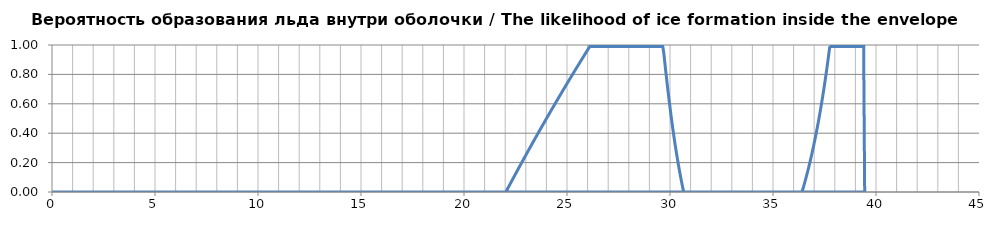
| Category | Вероятность образования льда внутри оболочки / The likelihood of ice formation inside the envelope |
|---|---|
| 0.0 | 0 |
| 0.05 | 0 |
| 0.1 | 0 |
| 0.15000000000000002 | 0 |
| 0.2 | 0 |
| 0.25 | 0 |
| 0.3 | 0 |
| 0.35 | 0 |
| 0.39999999999999997 | 0 |
| 0.44999999999999996 | 0 |
| 0.49999999999999994 | 0 |
| 0.5499999999999999 | 0 |
| 0.6 | 0 |
| 0.65 | 0 |
| 0.7000000000000001 | 0 |
| 0.7500000000000001 | 0 |
| 0.8000000000000002 | 0 |
| 0.8500000000000002 | 0 |
| 0.9000000000000002 | 0 |
| 0.9500000000000003 | 0 |
| 1.0000000000000002 | 0 |
| 1.0500000000000003 | 0 |
| 1.1000000000000003 | 0 |
| 1.1500000000000004 | 0 |
| 1.2000000000000004 | 0 |
| 1.2500000000000004 | 0 |
| 1.3000000000000005 | 0 |
| 1.3500000000000005 | 0 |
| 1.4000000000000006 | 0 |
| 1.4500000000000006 | 0 |
| 1.5000000000000007 | 0 |
| 1.5500000000000007 | 0 |
| 1.6000000000000008 | 0 |
| 1.6500000000000008 | 0 |
| 1.7000000000000008 | 0 |
| 1.7500000000000009 | 0 |
| 1.800000000000001 | 0 |
| 1.850000000000001 | 0 |
| 1.900000000000001 | 0 |
| 1.950000000000001 | 0 |
| 2.000000000000001 | 0 |
| 2.0500000000000007 | 0 |
| 2.1000000000000005 | 0 |
| 2.1500000000000004 | 0 |
| 2.2 | 0 |
| 2.25 | 0 |
| 2.3 | 0 |
| 2.3499999999999996 | 0 |
| 2.3999999999999995 | 0 |
| 2.4499999999999993 | 0 |
| 2.499999999999999 | 0 |
| 2.549999999999999 | 0 |
| 2.5999999999999988 | 0 |
| 2.6499999999999986 | 0 |
| 2.6999999999999984 | 0 |
| 2.7499999999999982 | 0 |
| 2.799999999999998 | 0 |
| 2.849999999999998 | 0 |
| 2.8999999999999977 | 0 |
| 2.9499999999999975 | 0 |
| 2.9999999999999973 | 0 |
| 3.049999999999997 | 0 |
| 3.099999999999997 | 0 |
| 3.149999999999997 | 0 |
| 3.1999999999999966 | 0 |
| 3.2499999999999964 | 0 |
| 3.2999999999999963 | 0 |
| 3.349999999999996 | 0 |
| 3.399999999999996 | 0 |
| 3.4499999999999957 | 0 |
| 3.4999999999999956 | 0 |
| 3.5499999999999954 | 0 |
| 3.599999999999995 | 0 |
| 3.649999999999995 | 0 |
| 3.699999999999995 | 0 |
| 3.7499999999999947 | 0 |
| 3.7999999999999945 | 0 |
| 3.8499999999999943 | 0 |
| 3.899999999999994 | 0 |
| 3.949999999999994 | 0 |
| 3.999999999999994 | 0 |
| 4.049999999999994 | 0 |
| 4.099999999999993 | 0 |
| 4.149999999999993 | 0 |
| 4.199999999999993 | 0 |
| 4.249999999999993 | 0 |
| 4.299999999999993 | 0 |
| 4.3499999999999925 | 0 |
| 4.399999999999992 | 0 |
| 4.449999999999992 | 0 |
| 4.499999999999992 | 0 |
| 4.549999999999992 | 0 |
| 4.599999999999992 | 0 |
| 4.6499999999999915 | 0 |
| 4.699999999999991 | 0 |
| 4.749999999999991 | 0 |
| 4.799999999999991 | 0 |
| 4.849999999999991 | 0 |
| 4.899999999999991 | 0 |
| 4.94999999999999 | 0 |
| 4.99999999999999 | 0 |
| 5.04999999999999 | 0 |
| 5.09999999999999 | 0 |
| 5.14999999999999 | 0 |
| 5.1999999999999895 | 0 |
| 5.249999999999989 | 0 |
| 5.299999999999989 | 0 |
| 5.349999999999989 | 0 |
| 5.399999999999989 | 0 |
| 5.449999999999989 | 0 |
| 5.4999999999999885 | 0 |
| 5.549999999999988 | 0 |
| 5.599999999999988 | 0 |
| 5.649999999999988 | 0 |
| 5.699999999999988 | 0 |
| 5.749999999999988 | 0 |
| 5.799999999999987 | 0 |
| 5.849999999999987 | 0 |
| 5.899999999999987 | 0 |
| 5.949999999999987 | 0 |
| 5.999999999999987 | 0 |
| 6.0499999999999865 | 0 |
| 6.099999999999986 | 0 |
| 6.149999999999986 | 0 |
| 6.199999999999986 | 0 |
| 6.249999999999986 | 0 |
| 6.299999999999986 | 0 |
| 6.349999999999985 | 0 |
| 6.399999999999985 | 0 |
| 6.449999999999985 | 0 |
| 6.499999999999985 | 0 |
| 6.549999999999985 | 0 |
| 6.5999999999999845 | 0 |
| 6.649999999999984 | 0 |
| 6.699999999999984 | 0 |
| 6.749999999999984 | 0 |
| 6.799999999999984 | 0 |
| 6.849999999999984 | 0 |
| 6.8999999999999835 | 0 |
| 6.949999999999983 | 0 |
| 6.999999999999983 | 0 |
| 7.049999999999983 | 0 |
| 7.099999999999983 | 0 |
| 7.149999999999983 | 0 |
| 7.199999999999982 | 0 |
| 7.249999999999982 | 0 |
| 7.299999999999982 | 0 |
| 7.349999999999982 | 0 |
| 7.399999999999982 | 0 |
| 7.4499999999999815 | 0 |
| 7.499999999999981 | 0 |
| 7.549999999999981 | 0 |
| 7.599999999999981 | 0 |
| 7.649999999999981 | 0 |
| 7.699999999999981 | 0 |
| 7.7499999999999805 | 0 |
| 7.79999999999998 | 0 |
| 7.84999999999998 | 0 |
| 7.89999999999998 | 0 |
| 7.94999999999998 | 0 |
| 7.99999999999998 | 0 |
| 8.04999999999998 | 0 |
| 8.09999999999998 | 0 |
| 8.14999999999998 | 0 |
| 8.199999999999982 | 0 |
| 8.249999999999982 | 0 |
| 8.299999999999983 | 0 |
| 8.349999999999984 | 0 |
| 8.399999999999984 | 0 |
| 8.449999999999985 | 0 |
| 8.499999999999986 | 0 |
| 8.549999999999986 | 0 |
| 8.599999999999987 | 0 |
| 8.649999999999988 | 0 |
| 8.699999999999989 | 0 |
| 8.74999999999999 | 0 |
| 8.79999999999999 | 0 |
| 8.84999999999999 | 0 |
| 8.899999999999991 | 0 |
| 8.949999999999992 | 0 |
| 8.999999999999993 | 0 |
| 9.049999999999994 | 0 |
| 9.099999999999994 | 0 |
| 9.149999999999995 | 0 |
| 9.199999999999996 | 0 |
| 9.249999999999996 | 0 |
| 9.299999999999997 | 0 |
| 9.349999999999998 | 0 |
| 9.399999999999999 | 0 |
| 9.45 | 0 |
| 9.5 | 0 |
| 9.55 | 0 |
| 9.600000000000001 | 0 |
| 9.650000000000002 | 0 |
| 9.700000000000003 | 0 |
| 9.750000000000004 | 0 |
| 9.800000000000004 | 0 |
| 9.850000000000005 | 0 |
| 9.900000000000006 | 0 |
| 9.950000000000006 | 0 |
| 10.000000000000007 | 0 |
| 10.050000000000008 | 0 |
| 10.100000000000009 | 0 |
| 10.15000000000001 | 0 |
| 10.20000000000001 | 0 |
| 10.25000000000001 | 0 |
| 10.300000000000011 | 0 |
| 10.350000000000012 | 0 |
| 10.400000000000013 | 0 |
| 10.450000000000014 | 0 |
| 10.500000000000014 | 0 |
| 10.550000000000015 | 0 |
| 10.600000000000016 | 0 |
| 10.650000000000016 | 0 |
| 10.700000000000017 | 0 |
| 10.750000000000018 | 0 |
| 10.800000000000018 | 0 |
| 10.85000000000002 | 0 |
| 10.90000000000002 | 0 |
| 10.95000000000002 | 0 |
| 11.000000000000021 | 0 |
| 11.050000000000022 | 0 |
| 11.100000000000023 | 0 |
| 11.150000000000023 | 0 |
| 11.200000000000024 | 0 |
| 11.250000000000025 | 0 |
| 11.300000000000026 | 0 |
| 11.350000000000026 | 0 |
| 11.400000000000027 | 0 |
| 11.450000000000028 | 0 |
| 11.500000000000028 | 0 |
| 11.55000000000003 | 0 |
| 11.60000000000003 | 0 |
| 11.65000000000003 | 0 |
| 11.700000000000031 | 0 |
| 11.750000000000032 | 0 |
| 11.800000000000033 | 0 |
| 11.850000000000033 | 0 |
| 11.900000000000034 | 0 |
| 11.950000000000035 | 0 |
| 12.000000000000036 | 0 |
| 12.050000000000036 | 0 |
| 12.100000000000037 | 0 |
| 12.150000000000038 | 0 |
| 12.200000000000038 | 0 |
| 12.250000000000039 | 0 |
| 12.30000000000004 | 0 |
| 12.35000000000004 | 0 |
| 12.400000000000041 | 0 |
| 12.450000000000042 | 0 |
| 12.500000000000043 | 0 |
| 12.550000000000043 | 0 |
| 12.600000000000044 | 0 |
| 12.650000000000045 | 0 |
| 12.700000000000045 | 0 |
| 12.750000000000046 | 0 |
| 12.800000000000047 | 0 |
| 12.850000000000048 | 0 |
| 12.900000000000048 | 0 |
| 12.950000000000049 | 0 |
| 13.00000000000005 | 0 |
| 13.05000000000005 | 0 |
| 13.100000000000051 | 0 |
| 13.150000000000052 | 0 |
| 13.200000000000053 | 0 |
| 13.250000000000053 | 0 |
| 13.300000000000054 | 0 |
| 13.350000000000055 | 0 |
| 13.400000000000055 | 0 |
| 13.450000000000056 | 0 |
| 13.500000000000057 | 0 |
| 13.550000000000058 | 0 |
| 13.600000000000058 | 0 |
| 13.650000000000059 | 0 |
| 13.70000000000006 | 0 |
| 13.75000000000006 | 0 |
| 13.800000000000061 | 0 |
| 13.850000000000062 | 0 |
| 13.900000000000063 | 0 |
| 13.950000000000063 | 0 |
| 14.000000000000064 | 0 |
| 14.050000000000065 | 0 |
| 14.100000000000065 | 0 |
| 14.150000000000066 | 0 |
| 14.200000000000067 | 0 |
| 14.250000000000068 | 0 |
| 14.300000000000068 | 0 |
| 14.350000000000069 | 0 |
| 14.40000000000007 | 0 |
| 14.45000000000007 | 0 |
| 14.500000000000071 | 0 |
| 14.550000000000072 | 0 |
| 14.600000000000072 | 0 |
| 14.650000000000073 | 0 |
| 14.700000000000074 | 0 |
| 14.750000000000075 | 0 |
| 14.800000000000075 | 0 |
| 14.850000000000076 | 0 |
| 14.900000000000077 | 0 |
| 14.950000000000077 | 0 |
| 15.000000000000078 | 0 |
| 15.050000000000079 | 0 |
| 15.10000000000008 | 0 |
| 15.15000000000008 | 0 |
| 15.200000000000081 | 0 |
| 15.250000000000082 | 0 |
| 15.300000000000082 | 0 |
| 15.350000000000083 | 0 |
| 15.400000000000084 | 0 |
| 15.450000000000085 | 0 |
| 15.500000000000085 | 0 |
| 15.550000000000086 | 0 |
| 15.600000000000087 | 0 |
| 15.650000000000087 | 0 |
| 15.700000000000088 | 0 |
| 15.750000000000089 | 0 |
| 15.80000000000009 | 0 |
| 15.85000000000009 | 0 |
| 15.900000000000091 | 0 |
| 15.950000000000092 | 0 |
| 16.000000000000092 | 0 |
| 16.050000000000093 | 0 |
| 16.100000000000094 | 0 |
| 16.150000000000095 | 0 |
| 16.200000000000095 | 0 |
| 16.250000000000096 | 0 |
| 16.300000000000097 | 0 |
| 16.350000000000097 | 0 |
| 16.400000000000098 | 0 |
| 16.4500000000001 | 0 |
| 16.5000000000001 | 0 |
| 16.5500000000001 | 0 |
| 16.6000000000001 | 0 |
| 16.6500000000001 | 0 |
| 16.700000000000102 | 0 |
| 16.750000000000103 | 0 |
| 16.800000000000104 | 0 |
| 16.850000000000104 | 0 |
| 16.900000000000105 | 0 |
| 16.950000000000106 | 0 |
| 17.000000000000107 | 0 |
| 17.050000000000107 | 0 |
| 17.100000000000108 | 0 |
| 17.15000000000011 | 0 |
| 17.20000000000011 | 0 |
| 17.25000000000011 | 0 |
| 17.30000000000011 | 0 |
| 17.35000000000011 | 0 |
| 17.400000000000112 | 0 |
| 17.450000000000113 | 0 |
| 17.500000000000114 | 0 |
| 17.550000000000114 | 0 |
| 17.600000000000115 | 0 |
| 17.650000000000116 | 0 |
| 17.700000000000117 | 0 |
| 17.750000000000117 | 0 |
| 17.800000000000118 | 0 |
| 17.85000000000012 | 0 |
| 17.90000000000012 | 0 |
| 17.95000000000012 | 0 |
| 18.00000000000012 | 0 |
| 18.05000000000012 | 0 |
| 18.100000000000122 | 0 |
| 18.150000000000123 | 0 |
| 18.200000000000124 | 0 |
| 18.250000000000124 | 0 |
| 18.300000000000125 | 0 |
| 18.350000000000126 | 0 |
| 18.400000000000126 | 0 |
| 18.450000000000127 | 0 |
| 18.500000000000128 | 0 |
| 18.55000000000013 | 0 |
| 18.60000000000013 | 0 |
| 18.65000000000013 | 0 |
| 18.70000000000013 | 0 |
| 18.75000000000013 | 0 |
| 18.800000000000132 | 0 |
| 18.850000000000133 | 0 |
| 18.900000000000134 | 0 |
| 18.950000000000134 | 0 |
| 19.000000000000135 | 0 |
| 19.050000000000136 | 0 |
| 19.100000000000136 | 0 |
| 19.150000000000137 | 0 |
| 19.200000000000138 | 0 |
| 19.25000000000014 | 0 |
| 19.30000000000014 | 0 |
| 19.35000000000014 | 0 |
| 19.40000000000014 | 0 |
| 19.45000000000014 | 0 |
| 19.500000000000142 | 0 |
| 19.550000000000143 | 0 |
| 19.600000000000144 | 0 |
| 19.650000000000144 | 0 |
| 19.700000000000145 | 0 |
| 19.750000000000146 | 0 |
| 19.800000000000146 | 0 |
| 19.850000000000147 | 0 |
| 19.900000000000148 | 0 |
| 19.95000000000015 | 0 |
| 20.00000000000015 | 0 |
| 20.05000000000015 | 0 |
| 20.10000000000015 | 0 |
| 20.15000000000015 | 0 |
| 20.200000000000152 | 0 |
| 20.250000000000153 | 0 |
| 20.300000000000153 | 0 |
| 20.350000000000154 | 0 |
| 20.400000000000155 | 0 |
| 20.450000000000156 | 0 |
| 20.500000000000156 | 0 |
| 20.550000000000157 | 0 |
| 20.600000000000158 | 0 |
| 20.65000000000016 | 0 |
| 20.70000000000016 | 0 |
| 20.75000000000016 | 0 |
| 20.80000000000016 | 0 |
| 20.85000000000016 | 0 |
| 20.900000000000162 | 0 |
| 20.950000000000163 | 0 |
| 21.000000000000163 | 0 |
| 21.050000000000164 | 0 |
| 21.100000000000165 | 0 |
| 21.150000000000166 | 0 |
| 21.200000000000166 | 0 |
| 21.250000000000167 | 0 |
| 21.300000000000168 | 0 |
| 21.35000000000017 | 0 |
| 21.40000000000017 | 0 |
| 21.45000000000017 | 0 |
| 21.50000000000017 | 0 |
| 21.55000000000017 | 0 |
| 21.600000000000172 | 0 |
| 21.650000000000173 | 0 |
| 21.700000000000173 | 0 |
| 21.750000000000174 | 0 |
| 21.800000000000175 | 0 |
| 21.850000000000176 | 0 |
| 21.900000000000176 | 0 |
| 21.950000000000177 | 0 |
| 22.000000000000178 | 0 |
| 22.05000000000018 | 0.005 |
| 22.10000000000018 | 0.018 |
| 22.15000000000018 | 0.031 |
| 22.20000000000018 | 0.044 |
| 22.25000000000018 | 0.057 |
| 22.300000000000182 | 0.07 |
| 22.350000000000183 | 0.084 |
| 22.400000000000183 | 0.097 |
| 22.450000000000184 | 0.109 |
| 22.500000000000185 | 0.122 |
| 22.550000000000185 | 0.135 |
| 22.600000000000186 | 0.148 |
| 22.650000000000187 | 0.161 |
| 22.700000000000188 | 0.174 |
| 22.75000000000019 | 0.187 |
| 22.80000000000019 | 0.2 |
| 22.85000000000019 | 0.212 |
| 22.90000000000019 | 0.225 |
| 22.95000000000019 | 0.238 |
| 23.000000000000192 | 0.251 |
| 23.050000000000193 | 0.263 |
| 23.100000000000193 | 0.276 |
| 23.150000000000194 | 0.288 |
| 23.200000000000195 | 0.301 |
| 23.250000000000195 | 0.314 |
| 23.300000000000196 | 0.326 |
| 23.350000000000197 | 0.339 |
| 23.400000000000198 | 0.351 |
| 23.4500000000002 | 0.364 |
| 23.5000000000002 | 0.376 |
| 23.5500000000002 | 0.388 |
| 23.6000000000002 | 0.401 |
| 23.6500000000002 | 0.413 |
| 23.700000000000202 | 0.425 |
| 23.750000000000203 | 0.438 |
| 23.800000000000203 | 0.45 |
| 23.850000000000204 | 0.462 |
| 23.900000000000205 | 0.474 |
| 23.950000000000205 | 0.487 |
| 24.000000000000206 | 0.499 |
| 24.050000000000207 | 0.511 |
| 24.100000000000207 | 0.523 |
| 24.150000000000208 | 0.535 |
| 24.20000000000021 | 0.547 |
| 24.25000000000021 | 0.559 |
| 24.30000000000021 | 0.571 |
| 24.35000000000021 | 0.583 |
| 24.40000000000021 | 0.595 |
| 24.450000000000212 | 0.607 |
| 24.500000000000213 | 0.619 |
| 24.550000000000214 | 0.631 |
| 24.600000000000215 | 0.643 |
| 24.650000000000215 | 0.655 |
| 24.700000000000216 | 0.667 |
| 24.750000000000217 | 0.678 |
| 24.800000000000217 | 0.69 |
| 24.850000000000218 | 0.702 |
| 24.90000000000022 | 0.714 |
| 24.95000000000022 | 0.725 |
| 25.00000000000022 | 0.737 |
| 25.05000000000022 | 0.749 |
| 25.10000000000022 | 0.76 |
| 25.150000000000222 | 0.772 |
| 25.200000000000223 | 0.784 |
| 25.250000000000224 | 0.795 |
| 25.300000000000225 | 0.807 |
| 25.350000000000225 | 0.818 |
| 25.400000000000226 | 0.83 |
| 25.450000000000227 | 0.841 |
| 25.500000000000227 | 0.853 |
| 25.550000000000228 | 0.864 |
| 25.60000000000023 | 0.876 |
| 25.65000000000023 | 0.887 |
| 25.70000000000023 | 0.898 |
| 25.75000000000023 | 0.91 |
| 25.80000000000023 | 0.921 |
| 25.850000000000232 | 0.932 |
| 25.900000000000233 | 0.944 |
| 25.950000000000234 | 0.955 |
| 26.000000000000234 | 0.966 |
| 26.050000000000235 | 0.977 |
| 26.100000000000236 | 0.988 |
| 26.150000000000237 | 1 |
| 26.200000000000237 | 0.99 |
| 26.250000000000238 | 0.99 |
| 26.30000000000024 | 0.99 |
| 26.35000000000024 | 0.99 |
| 26.40000000000024 | 0.99 |
| 26.45000000000024 | 0.99 |
| 26.50000000000024 | 0.99 |
| 26.550000000000242 | 0.99 |
| 26.600000000000243 | 0.99 |
| 26.650000000000244 | 0.99 |
| 26.700000000000244 | 0.99 |
| 26.750000000000245 | 0.99 |
| 26.800000000000246 | 0.99 |
| 26.850000000000247 | 0.99 |
| 26.900000000000247 | 0.99 |
| 26.950000000000248 | 0.99 |
| 27.00000000000025 | 0.99 |
| 27.05000000000025 | 0.99 |
| 27.10000000000025 | 0.99 |
| 27.15000000000025 | 0.99 |
| 27.20000000000025 | 0.99 |
| 27.250000000000252 | 0.99 |
| 27.300000000000253 | 0.99 |
| 27.350000000000254 | 0.99 |
| 27.400000000000254 | 0.99 |
| 27.450000000000255 | 0.99 |
| 27.500000000000256 | 0.99 |
| 27.550000000000257 | 0.99 |
| 27.600000000000257 | 0.99 |
| 27.650000000000258 | 0.99 |
| 27.70000000000026 | 0.99 |
| 27.75000000000026 | 0.99 |
| 27.80000000000026 | 0.99 |
| 27.85000000000026 | 0.99 |
| 27.90000000000026 | 0.99 |
| 27.950000000000262 | 0.99 |
| 28.000000000000263 | 0.99 |
| 28.050000000000264 | 0.99 |
| 28.100000000000264 | 0.99 |
| 28.150000000000265 | 0.99 |
| 28.200000000000266 | 0.99 |
| 28.250000000000266 | 0.99 |
| 28.300000000000267 | 0.99 |
| 28.350000000000268 | 0.99 |
| 28.40000000000027 | 0.99 |
| 28.45000000000027 | 0.99 |
| 28.50000000000027 | 0.99 |
| 28.55000000000027 | 0.99 |
| 28.60000000000027 | 0.99 |
| 28.650000000000272 | 0.99 |
| 28.700000000000273 | 0.99 |
| 28.750000000000274 | 0.99 |
| 28.800000000000274 | 0.99 |
| 28.850000000000275 | 0.99 |
| 28.900000000000276 | 0.99 |
| 28.950000000000276 | 0.99 |
| 29.000000000000277 | 0.99 |
| 29.050000000000278 | 0.99 |
| 29.10000000000028 | 0.99 |
| 29.15000000000028 | 0.99 |
| 29.20000000000028 | 0.99 |
| 29.25000000000028 | 0.99 |
| 29.30000000000028 | 0.99 |
| 29.350000000000282 | 0.99 |
| 29.400000000000283 | 0.99 |
| 29.450000000000284 | 0.99 |
| 29.500000000000284 | 0.99 |
| 29.550000000000285 | 0.99 |
| 29.600000000000286 | 0.99 |
| 29.650000000000286 | 0.99 |
| 29.700000000000287 | 0.944 |
| 29.750000000000288 | 0.878 |
| 29.80000000000029 | 0.814 |
| 29.85000000000029 | 0.751 |
| 29.90000000000029 | 0.691 |
| 29.95000000000029 | 0.632 |
| 30.00000000000029 | 0.576 |
| 30.050000000000292 | 0.521 |
| 30.100000000000293 | 0.468 |
| 30.150000000000293 | 0.418 |
| 30.200000000000294 | 0.369 |
| 30.250000000000295 | 0.322 |
| 30.300000000000296 | 0.277 |
| 30.350000000000296 | 0.234 |
| 30.400000000000297 | 0.192 |
| 30.450000000000298 | 0.152 |
| 30.5000000000003 | 0.114 |
| 30.5500000000003 | 0.078 |
| 30.6000000000003 | 0.042 |
| 30.6500000000003 | 0.009 |
| 30.7000000000003 | 0 |
| 30.750000000000302 | 0 |
| 30.800000000000303 | 0 |
| 30.850000000000303 | 0 |
| 30.900000000000304 | 0 |
| 30.950000000000305 | 0 |
| 31.000000000000306 | 0 |
| 31.050000000000306 | 0 |
| 31.100000000000307 | 0 |
| 31.150000000000308 | 0 |
| 31.20000000000031 | 0 |
| 31.25000000000031 | 0 |
| 31.30000000000031 | 0 |
| 31.35000000000031 | 0 |
| 31.40000000000031 | 0 |
| 31.450000000000312 | 0 |
| 31.500000000000313 | 0 |
| 31.550000000000313 | 0 |
| 31.600000000000314 | 0 |
| 31.650000000000315 | 0 |
| 31.700000000000315 | 0 |
| 31.750000000000316 | 0 |
| 31.800000000000317 | 0 |
| 31.850000000000318 | 0 |
| 31.90000000000032 | 0 |
| 31.95000000000032 | 0 |
| 32.00000000000032 | 0 |
| 32.05000000000032 | 0 |
| 32.100000000000314 | 0 |
| 32.15000000000031 | 0 |
| 32.20000000000031 | 0 |
| 32.250000000000306 | 0 |
| 32.3000000000003 | 0 |
| 32.3500000000003 | 0 |
| 32.4000000000003 | 0 |
| 32.450000000000294 | 0 |
| 32.50000000000029 | 0 |
| 32.55000000000029 | 0 |
| 32.600000000000286 | 0 |
| 32.65000000000028 | 0 |
| 32.70000000000028 | 0 |
| 32.75000000000028 | 0 |
| 32.800000000000274 | 0 |
| 32.85000000000027 | 0 |
| 32.90000000000027 | 0 |
| 32.950000000000266 | 0 |
| 33.00000000000026 | 0 |
| 33.05000000000026 | 0 |
| 33.10000000000026 | 0 |
| 33.150000000000254 | 0 |
| 33.20000000000025 | 0 |
| 33.25000000000025 | 0 |
| 33.300000000000246 | 0 |
| 33.35000000000024 | 0 |
| 33.40000000000024 | 0 |
| 33.45000000000024 | 0 |
| 33.500000000000234 | 0 |
| 33.55000000000023 | 0 |
| 33.60000000000023 | 0 |
| 33.650000000000226 | 0 |
| 33.70000000000022 | 0 |
| 33.75000000000022 | 0 |
| 33.80000000000022 | 0 |
| 33.850000000000215 | 0 |
| 33.90000000000021 | 0 |
| 33.95000000000021 | 0 |
| 34.000000000000206 | 0 |
| 34.0500000000002 | 0 |
| 34.1000000000002 | 0 |
| 34.1500000000002 | 0 |
| 34.200000000000195 | 0 |
| 34.25000000000019 | 0 |
| 34.30000000000019 | 0 |
| 34.350000000000186 | 0 |
| 34.40000000000018 | 0 |
| 34.45000000000018 | 0 |
| 34.50000000000018 | 0 |
| 34.550000000000175 | 0 |
| 34.60000000000017 | 0 |
| 34.65000000000017 | 0 |
| 34.700000000000166 | 0 |
| 34.75000000000016 | 0 |
| 34.80000000000016 | 0 |
| 34.85000000000016 | 0 |
| 34.900000000000155 | 0 |
| 34.95000000000015 | 0 |
| 35.00000000000015 | 0 |
| 35.050000000000146 | 0 |
| 35.10000000000014 | 0 |
| 35.15000000000014 | 0 |
| 35.20000000000014 | 0 |
| 35.250000000000135 | 0 |
| 35.30000000000013 | 0 |
| 35.35000000000013 | 0 |
| 35.40000000000013 | 0 |
| 35.450000000000124 | 0 |
| 35.50000000000012 | 0 |
| 35.55000000000012 | 0 |
| 35.600000000000115 | 0 |
| 35.65000000000011 | 0 |
| 35.70000000000011 | 0 |
| 35.75000000000011 | 0 |
| 35.800000000000104 | 0 |
| 35.8500000000001 | 0 |
| 35.9000000000001 | 0 |
| 35.950000000000095 | 0 |
| 36.00000000000009 | 0 |
| 36.05000000000009 | 0 |
| 36.10000000000009 | 0 |
| 36.150000000000084 | 0 |
| 36.20000000000008 | 0 |
| 36.25000000000008 | 0 |
| 36.300000000000075 | 0 |
| 36.35000000000007 | 0 |
| 36.40000000000007 | 0 |
| 36.45000000000007 | 0.02 |
| 36.500000000000064 | 0.044 |
| 36.55000000000006 | 0.07 |
| 36.60000000000006 | 0.095 |
| 36.650000000000055 | 0.122 |
| 36.70000000000005 | 0.149 |
| 36.75000000000005 | 0.178 |
| 36.80000000000005 | 0.207 |
| 36.850000000000044 | 0.237 |
| 36.90000000000004 | 0.268 |
| 36.95000000000004 | 0.3 |
| 37.000000000000036 | 0.333 |
| 37.05000000000003 | 0.367 |
| 37.10000000000003 | 0.402 |
| 37.15000000000003 | 0.439 |
| 37.200000000000024 | 0.476 |
| 37.25000000000002 | 0.515 |
| 37.30000000000002 | 0.555 |
| 37.350000000000016 | 0.597 |
| 37.40000000000001 | 0.639 |
| 37.45000000000001 | 0.684 |
| 37.50000000000001 | 0.729 |
| 37.550000000000004 | 0.777 |
| 37.6 | 0.826 |
| 37.65 | 0.877 |
| 37.699999999999996 | 0.929 |
| 37.74999999999999 | 0.983 |
| 37.79999999999999 | 0.99 |
| 37.84999999999999 | 0.99 |
| 37.899999999999984 | 0.99 |
| 37.94999999999998 | 0.99 |
| 37.99999999999998 | 0.99 |
| 38.049999999999976 | 0.99 |
| 38.09999999999997 | 0.99 |
| 38.14999999999997 | 0.99 |
| 38.19999999999997 | 0.99 |
| 38.249999999999964 | 0.99 |
| 38.29999999999996 | 0.99 |
| 38.34999999999996 | 0.99 |
| 38.399999999999956 | 0.99 |
| 38.44999999999995 | 0.99 |
| 38.49999999999995 | 0.99 |
| 38.54999999999995 | 0.99 |
| 38.599999999999945 | 0.99 |
| 38.64999999999994 | 0.99 |
| 38.69999999999994 | 0.99 |
| 38.749999999999936 | 0.99 |
| 38.79999999999993 | 0.99 |
| 38.84999999999993 | 0.99 |
| 38.89999999999993 | 0.99 |
| 38.949999999999925 | 0.99 |
| 38.99999999999992 | 0.99 |
| 39.04999999999992 | 0.99 |
| 39.099999999999916 | 0.99 |
| 39.14999999999991 | 0.99 |
| 39.19999999999991 | 0.99 |
| 39.24999999999991 | 0.99 |
| 39.299999999999905 | 0.99 |
| 39.3499999999999 | 0.99 |
| 39.3999999999999 | 0.99 |
| 39.449999999999896 | 0 |
| 1.0 | 0 |
| 1.0 | 0 |
| 1.0 | 0 |
| 1.0 | 0 |
| 1.0 | 0 |
| 1.0 | 0 |
| 1.0 | 0 |
| 1.0 | 0 |
| 1.0 | 0 |
| 1.0 | 0 |
| 1.0 | 0 |
| 1.0 | 0 |
| 1.0 | 0 |
| 1.0 | 0 |
| 1.0 | 0 |
| 1.0 | 0 |
| 1.0 | 0 |
| 1.0 | 0 |
| 1.0 | 0 |
| 1.0 | 0 |
| 1.0 | 0 |
| 1.0 | 0 |
| 1.0 | 0 |
| 1.0 | 0 |
| 1.0 | 0 |
| 1.0 | 0 |
| 1.0 | 0 |
| 1.0 | 0 |
| 1.0 | 0 |
| 1.0 | 0 |
| 1.0 | 0 |
| 1.0 | 0 |
| 1.0 | 0 |
| 1.0 | 0 |
| 1.0 | 0 |
| 1.0 | 0 |
| 1.0 | 0 |
| 1.0 | 0 |
| 1.0 | 0 |
| 1.0 | 0 |
| 1.0 | 0 |
| 1.0 | 0 |
| 1.0 | 0 |
| 1.0 | 0 |
| 1.0 | 0 |
| 1.0 | 0 |
| 1.0 | 0 |
| 1.0 | 0 |
| 1.0 | 0 |
| 1.0 | 0 |
| 1.0 | 0 |
| 1.0 | 0 |
| 1.0 | 0 |
| 1.0 | 0 |
| 1.0 | 0 |
| 1.0 | 0 |
| 1.0 | 0 |
| 1.0 | 0 |
| 1.0 | 0 |
| 1.0 | 0 |
| 1.0 | 0 |
| 1.0 | 0 |
| 1.0 | 0 |
| 1.0 | 0 |
| 1.0 | 0 |
| 1.0 | 0 |
| 1.0 | 0 |
| 1.0 | 0 |
| 1.0 | 0 |
| 1.0 | 0 |
| 1.0 | 0 |
| 1.0 | 0 |
| 1.0 | 0 |
| 1.0 | 0 |
| 1.0 | 0 |
| 1.0 | 0 |
| 1.0 | 0 |
| 1.0 | 0 |
| 1.0 | 0 |
| 1.0 | 0 |
| 1.0 | 0 |
| 1.0 | 0 |
| 1.0 | 0 |
| 1.0 | 0 |
| 1.0 | 0 |
| 1.0 | 0 |
| 1.0 | 0 |
| 1.0 | 0 |
| 1.0 | 0 |
| 1.0 | 0 |
| 1.0 | 0 |
| 1.0 | 0 |
| 1.0 | 0 |
| 1.0 | 0 |
| 1.0 | 0 |
| 1.0 | 0 |
| 1.0 | 0 |
| 1.0 | 0 |
| 1.0 | 0 |
| 1.0 | 0 |
| 1.0 | 0 |
| 1.0 | 0 |
| 1.0 | 0 |
| 1.0 | 0 |
| 1.0 | 0 |
| 1.0 | 0 |
| 1.0 | 0 |
| 1.0 | 0 |
| 1.0 | 0 |
| 1.0 | 0 |
| 1.0 | 0 |
| 1.0 | 0 |
| 1.0 | 0 |
| 1.0 | 0 |
| 1.0 | 0 |
| 1.0 | 0 |
| 1.0 | 0 |
| 1.0 | 0 |
| 1.0 | 0 |
| 1.0 | 0 |
| 1.0 | 0 |
| 1.0 | 0 |
| 1.0 | 0 |
| 1.0 | 0 |
| 1.0 | 0 |
| 1.0 | 0 |
| 1.0 | 0 |
| 1.0 | 0 |
| 1.0 | 0 |
| 1.0 | 0 |
| 1.0 | 0 |
| 1.0 | 0 |
| 1.0 | 0 |
| 1.0 | 0 |
| 1.0 | 0 |
| 1.0 | 0 |
| 1.0 | 0 |
| 1.0 | 0 |
| 1.0 | 0 |
| 1.0 | 0 |
| 1.0 | 0 |
| 1.0 | 0 |
| 1.0 | 0 |
| 1.0 | 0 |
| 1.0 | 0 |
| 1.0 | 0 |
| 1.0 | 0 |
| 1.0 | 0 |
| 1.0 | 0 |
| 1.0 | 0 |
| 1.0 | 0 |
| 1.0 | 0 |
| 1.0 | 0 |
| 1.0 | 0 |
| 1.0 | 0 |
| 1.0 | 0 |
| 1.0 | 0 |
| 1.0 | 0 |
| 1.0 | 0 |
| 1.0 | 0 |
| 1.0 | 0 |
| 1.0 | 0 |
| 1.0 | 0 |
| 1.0 | 0 |
| 1.0 | 0 |
| 1.0 | 0 |
| 1.0 | 0 |
| 1.0 | 0 |
| 1.0 | 0 |
| 1.0 | 0 |
| 1.0 | 0 |
| 1.0 | 0 |
| 1.0 | 0 |
| 1.0 | 0 |
| 1.0 | 0 |
| 1.0 | 0 |
| 1.0 | 0 |
| 1.0 | 0 |
| 1.0 | 0 |
| 1.0 | 0 |
| 1.0 | 0 |
| 1.0 | 0 |
| 1.0 | 0 |
| 1.0 | 0 |
| 1.0 | 0 |
| 1.0 | 0 |
| 1.0 | 0 |
| 1.0 | 0 |
| 1.0 | 0 |
| 1.0 | 0 |
| 1.0 | 0 |
| 1.0 | 0 |
| 1.0 | 0 |
| 1.0 | 0 |
| 1.0 | 0 |
| 1.0 | 0 |
| 1.0 | 0 |
| 1.0 | 0 |
| 1.0 | 0 |
| 1.0 | 0 |
| 1.0 | 0 |
| 1.0 | 0 |
| 1.0 | 0 |
| 1.0 | 0 |
| 1.0 | 0 |
| 1.0 | 0 |
| 1.0 | 0 |
| 1.0 | 0 |
| 1.0 | 0 |
| 1.0 | 0 |
| 1.0 | 0 |
| 1.0 | 0 |
| 1.0 | 0 |
| 1.0 | 0 |
| 1.0 | 0 |
| 1.0 | 0 |
| 1.0 | 0 |
| 1.0 | 0 |
| 1.0 | 0 |
| 1.0 | 0 |
| 1.0 | 0 |
| 1.0 | 0 |
| 1.0 | 0 |
| 1.0 | 0 |
| 1.0 | 0 |
| 1.0 | 0 |
| 1.0 | 0 |
| 1.0 | 0 |
| 1.0 | 0 |
| 1.0 | 0 |
| 1.0 | 0 |
| 1.0 | 0 |
| 1.0 | 0 |
| 1.0 | 0 |
| 1.0 | 0 |
| 1.0 | 0 |
| 1.0 | 0 |
| 1.0 | 0 |
| 1.0 | 0 |
| 1.0 | 0 |
| 1.0 | 0 |
| 1.0 | 0 |
| 1.0 | 0 |
| 1.0 | 0 |
| 1.0 | 0 |
| 1.0 | 0 |
| 1.0 | 0 |
| 1.0 | 0 |
| 1.0 | 0 |
| 1.0 | 0 |
| 1.0 | 0 |
| 1.0 | 0 |
| 1.0 | 0 |
| 1.0 | 0 |
| 1.0 | 0 |
| 1.0 | 0 |
| 1.0 | 0 |
| 1.0 | 0 |
| 1.0 | 0 |
| 1.0 | 0 |
| 1.0 | 0 |
| 1.0 | 0 |
| 1.0 | 0 |
| 1.0 | 0 |
| 1.0 | 0 |
| 1.0 | 0 |
| 1.0 | 0 |
| 1.0 | 0 |
| 1.0 | 0 |
| 1.0 | 0 |
| 1.0 | 0 |
| 1.0 | 0 |
| 1.0 | 0 |
| 1.0 | 0 |
| 1.0 | 0 |
| 1.0 | 0 |
| 1.0 | 0 |
| 1.0 | 0 |
| 1.0 | 0 |
| 1.0 | 0 |
| 1.0 | 0 |
| 1.0 | 0 |
| 1.0 | 0 |
| 1.0 | 0 |
| 1.0 | 0 |
| 1.0 | 0 |
| 1.0 | 0 |
| 1.0 | 0 |
| 1.0 | 0 |
| 1.0 | 0 |
| 1.0 | 0 |
| 1.0 | 0 |
| 1.0 | 0 |
| 1.0 | 0 |
| 1.0 | 0 |
| 1.0 | 0 |
| 1.0 | 0 |
| 1.0 | 0 |
| 1.0 | 0 |
| 1.0 | 0 |
| 1.0 | 0 |
| 1.0 | 0 |
| 1.0 | 0 |
| 1.0 | 0 |
| 1.0 | 0 |
| 1.0 | 0 |
| 1.0 | 0 |
| 1.0 | 0 |
| 1.0 | 0 |
| 1.0 | 0 |
| 1.0 | 0 |
| 1.0 | 0 |
| 1.0 | 0 |
| 1.0 | 0 |
| 1.0 | 0 |
| 1.0 | 0 |
| 1.0 | 0 |
| 1.0 | 0 |
| 1.0 | 0 |
| 1.0 | 0 |
| 1.0 | 0 |
| 1.0 | 0 |
| 1.0 | 0 |
| 1.0 | 0 |
| 1.0 | 0 |
| 1.0 | 0 |
| 1.0 | 0 |
| 1.0 | 0 |
| 1.0 | 0 |
| 1.0 | 0 |
| 1.0 | 0 |
| 1.0 | 0 |
| 1.0 | 0 |
| 1.0 | 0 |
| 1.0 | 0 |
| 1.0 | 0 |
| 1.0 | 0 |
| 1.0 | 0 |
| 1.0 | 0 |
| 1.0 | 0 |
| 1.0 | 0 |
| 1.0 | 0 |
| 1.0 | 0 |
| 1.0 | 0 |
| 1.0 | 0 |
| 1.0 | 0 |
| 1.0 | 0 |
| 1.0 | 0 |
| 1.0 | 0 |
| 1.0 | 0 |
| 1.0 | 0 |
| 1.0 | 0 |
| 1.0 | 0 |
| 1.0 | 0 |
| 1.0 | 0 |
| 1.0 | 0 |
| 1.0 | 0 |
| 1.0 | 0 |
| 1.0 | 0 |
| 1.0 | 0 |
| 1.0 | 0 |
| 1.0 | 0 |
| 1.0 | 0 |
| 1.0 | 0 |
| 1.0 | 0 |
| 1.0 | 0 |
| 1.0 | 0 |
| 1.0 | 0 |
| 1.0 | 0 |
| 1.0 | 0 |
| 1.0 | 0 |
| 1.0 | 0 |
| 1.0 | 0 |
| 1.0 | 0 |
| 1.0 | 0 |
| 1.0 | 0 |
| 1.0 | 0 |
| 1.0 | 0 |
| 1.0 | 0 |
| 1.0 | 0 |
| 1.0 | 0 |
| 1.0 | 0 |
| 1.0 | 0 |
| 1.0 | 0 |
| 1.0 | 0 |
| 1.0 | 0 |
| 1.0 | 0 |
| 1.0 | 0 |
| 1.0 | 0 |
| 1.0 | 0 |
| 1.0 | 0 |
| 1.0 | 0 |
| 1.0 | 0 |
| 1.0 | 0 |
| 1.0 | 0 |
| 1.0 | 0 |
| 1.0 | 0 |
| 1.0 | 0 |
| 1.0 | 0 |
| 1.0 | 0 |
| 1.0 | 0 |
| 1.0 | 0 |
| 1.0 | 0 |
| 1.0 | 0 |
| 1.0 | 0 |
| 1.0 | 0 |
| 1.0 | 0 |
| 1.0 | 0 |
| 1.0 | 0 |
| 1.0 | 0 |
| 1.0 | 0 |
| 1.0 | 0 |
| 1.0 | 0 |
| 1.0 | 0 |
| 1.0 | 0 |
| 1.0 | 0 |
| 1.0 | 0 |
| 1.0 | 0 |
| 1.0 | 0 |
| 1.0 | 0 |
| 1.0 | 0 |
| 1.0 | 0 |
| 1.0 | 0 |
| 1.0 | 0 |
| 1.0 | 0 |
| 1.0 | 0 |
| 1.0 | 0 |
| 1.0 | 0 |
| 1.0 | 0 |
| 1.0 | 0 |
| 1.0 | 0 |
| 1.0 | 0 |
| 1.0 | 0 |
| 1.0 | 0 |
| 1.0 | 0 |
| 1.0 | 0 |
| 1.0 | 0 |
| 1.0 | 0 |
| 1.0 | 0 |
| 1.0 | 0 |
| 1.0 | 0 |
| 1.0 | 0 |
| 1.0 | 0 |
| 1.0 | 0 |
| 1.0 | 0 |
| 1.0 | 0 |
| 1.0 | 0 |
| 1.0 | 0 |
| 1.0 | 0 |
| 1.0 | 0 |
| 1.0 | 0 |
| 1.0 | 0 |
| 1.0 | 0 |
| 1.0 | 0 |
| 1.0 | 0 |
| 1.0 | 0 |
| 1.0 | 0 |
| 1.0 | 0 |
| 1.0 | 0 |
| 1.0 | 0 |
| 1.0 | 0 |
| 1.0 | 0 |
| 1.0 | 0 |
| 1.0 | 0 |
| 1.0 | 0 |
| 1.0 | 0 |
| 1.0 | 0 |
| 1.0 | 0 |
| 1.0 | 0 |
| 1.0 | 0 |
| 1.0 | 0 |
| 1.0 | 0 |
| 1.0 | 0 |
| 1.0 | 0 |
| 1.0 | 0 |
| 1.0 | 0 |
| 1.0 | 0 |
| 1.0 | 0 |
| 1.0 | 0 |
| 1.0 | 0 |
| 1.0 | 0 |
| 1.0 | 0 |
| 1.0 | 0 |
| 1.0 | 0 |
| 1.0 | 0 |
| 1.0 | 0 |
| 1.0 | 0 |
| 1.0 | 0 |
| 1.0 | 0 |
| 1.0 | 0 |
| 1.0 | 0 |
| 1.0 | 0 |
| 1.0 | 0 |
| 1.0 | 0 |
| 1.0 | 0 |
| 1.0 | 0 |
| 1.0 | 0 |
| 1.0 | 0 |
| 1.0 | 0 |
| 1.0 | 0 |
| 1.0 | 0 |
| 1.0 | 0 |
| 1.0 | 0 |
| 1.0 | 0 |
| 1.0 | 0 |
| 1.0 | 0 |
| 1.0 | 0 |
| 1.0 | 0 |
| 1.0 | 0 |
| 1.0 | 0 |
| 1.0 | 0 |